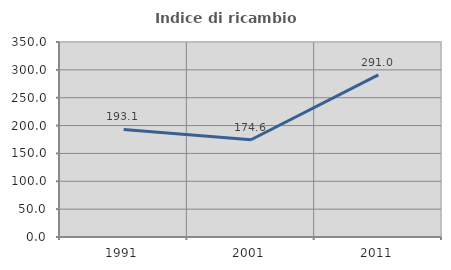
| Category | Indice di ricambio occupazionale  |
|---|---|
| 1991.0 | 193.056 |
| 2001.0 | 174.561 |
| 2011.0 | 291.045 |